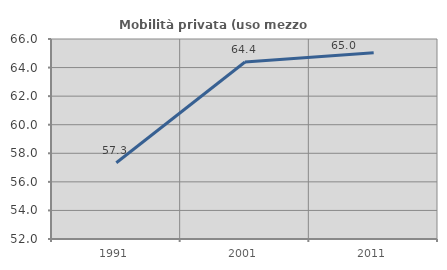
| Category | Mobilità privata (uso mezzo privato) |
|---|---|
| 1991.0 | 57.341 |
| 2001.0 | 64.393 |
| 2011.0 | 65.042 |